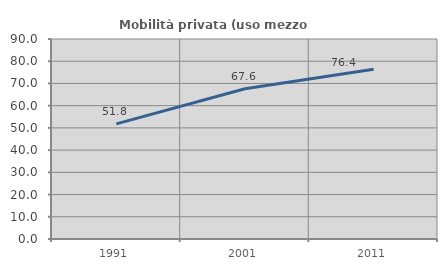
| Category | Mobilità privata (uso mezzo privato) |
|---|---|
| 1991.0 | 51.799 |
| 2001.0 | 67.598 |
| 2011.0 | 76.368 |